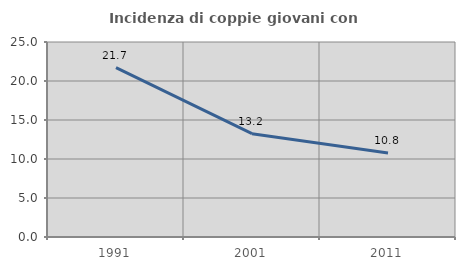
| Category | Incidenza di coppie giovani con figli |
|---|---|
| 1991.0 | 21.704 |
| 2001.0 | 13.243 |
| 2011.0 | 10.779 |